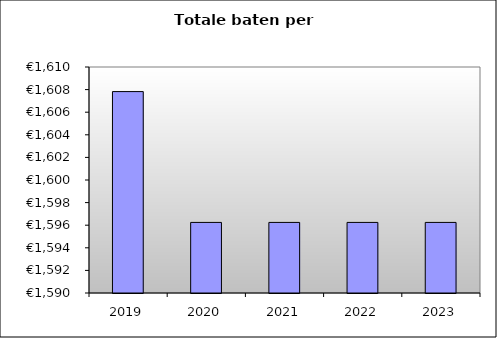
| Category | Series 0 |
|---|---|
| 2019.0 | 1607.824 |
| 2020.0 | 1596.246 |
| 2021.0 | 1596.246 |
| 2022.0 | 1596.246 |
| 2023.0 | 1596.246 |